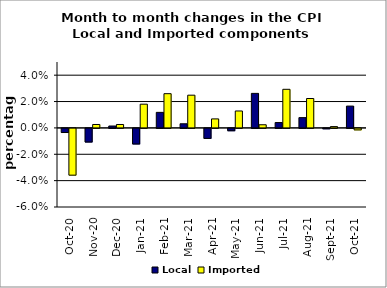
| Category | Local | Imported |
|---|---|---|
| 2020-10-01 | -0.003 | -0.035 |
| 2020-11-01 | -0.01 | 0.003 |
| 2020-12-01 | 0.001 | 0.003 |
| 2021-01-01 | -0.012 | 0.018 |
| 2021-02-01 | 0.012 | 0.026 |
| 2021-03-01 | 0.003 | 0.025 |
| 2021-04-01 | -0.008 | 0.007 |
| 2021-05-01 | -0.002 | 0.013 |
| 2021-06-01 | 0.026 | 0.002 |
| 2021-07-01 | 0.004 | 0.029 |
| 2021-08-01 | 0.008 | 0.022 |
| 2021-09-01 | 0 | 0.001 |
| 2021-10-01 | 0.017 | -0.001 |